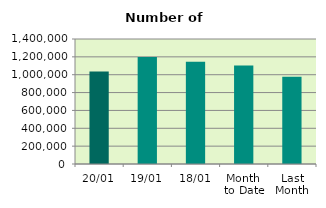
| Category | Series 0 |
|---|---|
| 20/01 | 1035200 |
| 19/01 | 1199180 |
| 18/01 | 1144364 |
| Month 
to Date | 1103769.467 |
| Last
Month | 976608.095 |